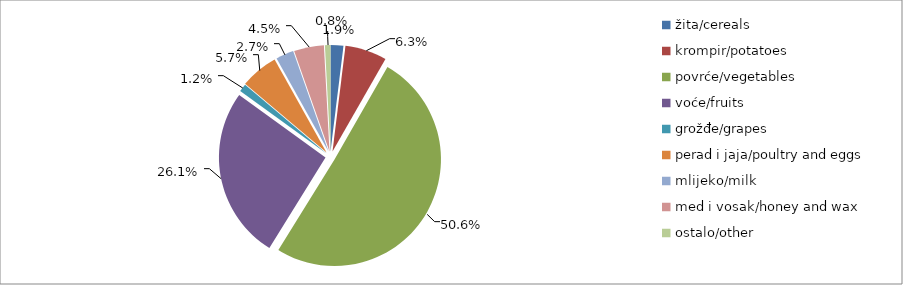
| Category | Series 0 |
|---|---|
| žita/cereals | 35840.5 |
| krompir/potatoes | 116665 |
| povrće/vegetables | 930767 |
| voće/fruits | 481047 |
| grožđe/grapes | 21956 |
| perad i jaja/poultry and eggs | 105694 |
| mlijeko/milk | 49997.5 |
| med i vosak/honey and wax | 83745 |
| ostalo/other | 15440 |